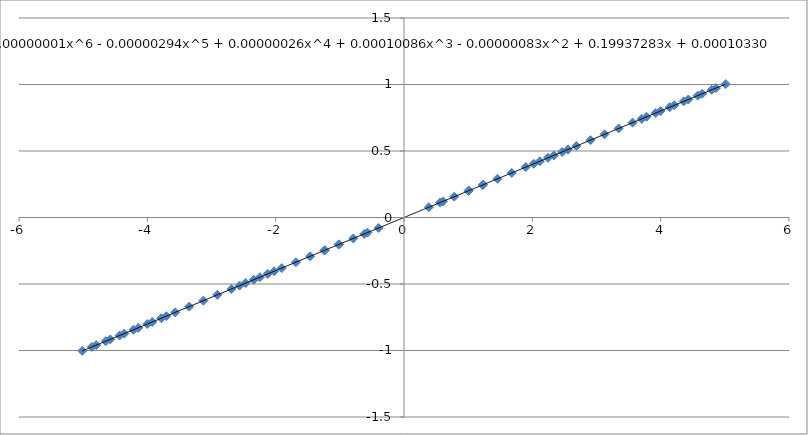
| Category | Series 0 |
|---|---|
| -5.014726 | -1.003 |
| -4.863674 | -0.973 |
| -4.795975 | -0.96 |
| -4.648021 | -0.93 |
| -4.577666 | -0.916 |
| -4.432476 | -0.887 |
| -4.3595 | -0.873 |
| -4.216272 | -0.844 |
| -4.141493 | -0.829 |
| -3.999786 | -0.801 |
| -3.92326 | -0.785 |
| -3.782813 | -0.757 |
| -3.704767 | -0.742 |
| -3.564989 | -0.714 |
| -3.346878 | -0.67 |
| -3.127818 | -0.626 |
| -2.90827 | -0.582 |
| -2.688118 | -0.537 |
| -2.562902 | -0.512 |
| -2.467225 | -0.493 |
| -2.342466 | -0.468 |
| -2.245809 | -0.449 |
| -2.124191 | -0.424 |
| -2.023616 | -0.404 |
| -1.904886 | -0.38 |
| -1.68446 | -0.336 |
| -1.462993 | -0.292 |
| -1.240674 | -0.248 |
| -1.232988 | -0.246 |
| -1.017714 | -0.203 |
| -1.011312 | -0.202 |
| -0.790656 | -0.158 |
| -0.617331 | -0.123 |
| -0.568863 | -0.113 |
| -0.395764 | -0.079 |
| 0.387338 | 0.077 |
| 0.562049 | 0.112 |
| 0.607876 | 0.121 |
| 0.783083 | 0.156 |
| 1.002972 | 0.2 |
| 1.012742 | 0.202 |
| 1.224452 | 0.245 |
| 1.2353 | 0.247 |
| 1.45717 | 0.291 |
| 1.678215 | 0.335 |
| 1.89828 | 0.379 |
| 2.02176 | 0.404 |
| 2.11725 | 0.423 |
| 2.24383 | 0.448 |
| 2.335435 | 0.467 |
| 2.465242 | 0.493 |
| 2.556142 | 0.511 |
| 2.686034 | 0.537 |
| 2.906142 | 0.581 |
| 3.125639 | 0.625 |
| 3.344602 | 0.669 |
| 3.562879 | 0.713 |
| 3.703764 | 0.742 |
| 3.780412 | 0.757 |
| 3.922293 | 0.785 |
| 3.997309 | 0.801 |
| 4.140623 | 0.829 |
| 4.213856 | 0.844 |
| 4.358643 | 0.873 |
| 4.429929 | 0.887 |
| 4.576813 | 0.916 |
| 4.645683 | 0.93 |
| 4.795143 | 0.96 |
| 4.861445 | 0.973 |
| 5.013862 | 1.003 |